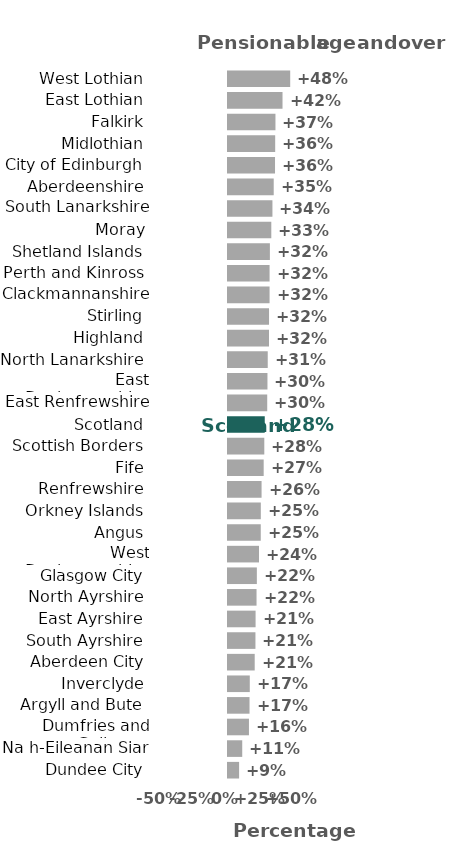
| Category | Series 0 |
|---|---|
| Dundee City | 8.539 |
| Na h-Eileanan Siar | 10.957 |
| Dumfries and Galloway | 16.113 |
| Argyll and Bute | 16.56 |
| Inverclyde | 16.759 |
| Aberdeen City | 20.539 |
| South Ayrshire | 21.107 |
| East Ayrshire | 21.223 |
| North Ayrshire | 21.958 |
| Glasgow City | 22.188 |
| West Dunbartonshire | 23.839 |
| Angus | 25.203 |
| Orkney Islands | 25.243 |
| Renfrewshire | 25.829 |
| Fife | 27.457 |
| Scottish Borders | 27.93 |
| Scotland | 28.271 |
| East Renfrewshire | 30.171 |
| East Dunbartonshire | 30.352 |
| North Lanarkshire | 30.559 |
| Highland | 31.542 |
| Stirling | 31.566 |
| Clackmannanshire | 31.977 |
| Perth and Kinross | 31.983 |
| Shetland Islands | 32.222 |
| Moray | 33.309 |
| South Lanarkshire | 34.175 |
| Aberdeenshire | 35.162 |
| City of Edinburgh | 36.169 |
| Midlothian | 36.293 |
| Falkirk | 36.507 |
| East Lothian | 41.926 |
| West Lothian | 47.856 |